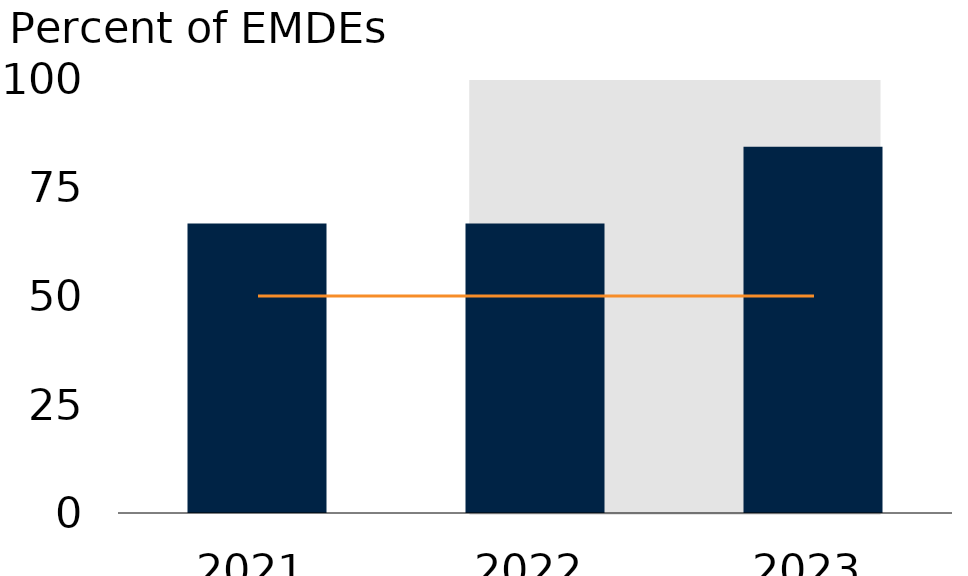
| Category | EMDEs |
|---|---|
| 2021.0 | 66.7 |
| 2022.0 | 66.7 |
| 2023.0 | 84.4 |